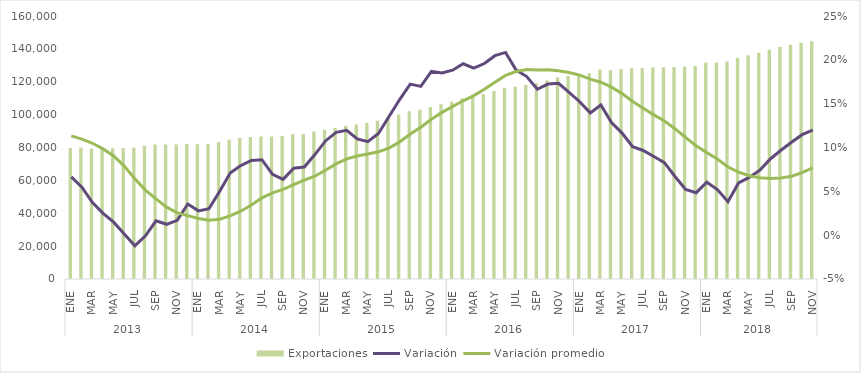
| Category | Exportaciones |
|---|---|
| 0 | 79726.788 |
| 1 | 79861.081 |
| 2 | 79296.627 |
| 3 | 79171.49 |
| 4 | 79492.645 |
| 5 | 79550.771 |
| 6 | 79858.433 |
| 7 | 81012.594 |
| 8 | 81851.534 |
| 9 | 81844.288 |
| 10 | 81843.769 |
| 11 | 82151.787 |
| 12 | 81938.864 |
| 13 | 82280.642 |
| 14 | 83250.626 |
| 15 | 84782.019 |
| 16 | 85798.757 |
| 17 | 86324.223 |
| 18 | 86731.253 |
| 19 | 86636.877 |
| 20 | 87063.384 |
| 21 | 88101.697 |
| 22 | 88201.544 |
| 23 | 89706.057 |
| 24 | 90745.342 |
| 25 | 91927.944 |
| 26 | 93209.37 |
| 27 | 94087.841 |
| 28 | 94943.416 |
| 29 | 96342.392 |
| 30 | 98464.563 |
| 31 | 100038.074 |
| 32 | 102061.637 |
| 33 | 103050.713 |
| 34 | 104670.097 |
| 35 | 106309.635 |
| 36 | 107820.253 |
| 37 | 109898.286 |
| 38 | 110962.208 |
| 39 | 112511.119 |
| 40 | 114382.536 |
| 41 | 116423.948 |
| 42 | 117002.026 |
| 43 | 118137.854 |
| 44 | 119049.393 |
| 45 | 120813.85 |
| 46 | 122803.892 |
| 47 | 123629.263 |
| 48 | 124230.37 |
| 49 | 125225.252 |
| 50 | 127433.236 |
| 51 | 126952.848 |
| 52 | 127702.594 |
| 53 | 128160.625 |
| 54 | 128306.16 |
| 55 | 128729.112 |
| 56 | 128888.736 |
| 57 | 128897.645 |
| 58 | 129198.934 |
| 59 | 129619.981 |
| 60 | 131722.122 |
| 61 | 131740.535 |
| 62 | 132290.579 |
| 63 | 134509.9 |
| 64 | 136112.216 |
| 65 | 137652.785 |
| 66 | 139458.154 |
| 67 | 141198.053 |
| 68 | 142550.058 |
| 69 | 143675.883 |
| 70 | 144666.727 |